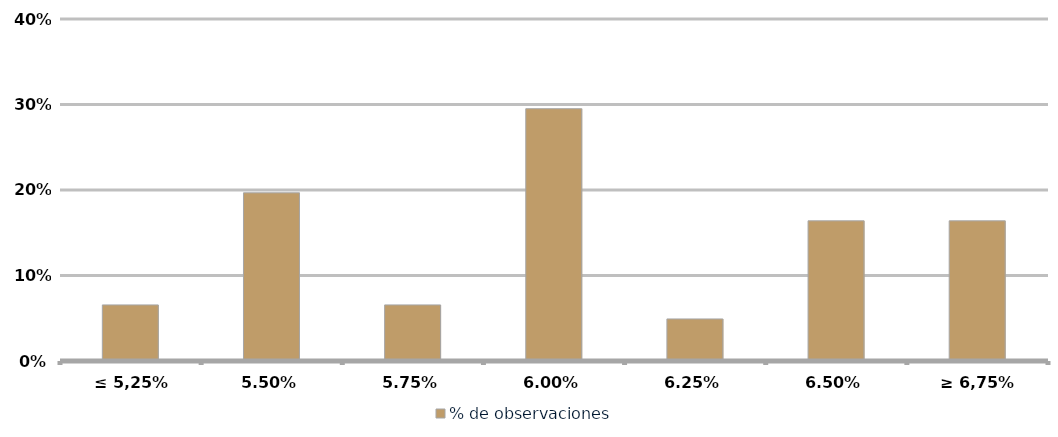
| Category | % de observaciones  |
|---|---|
| ≤ 5,25% | 0.066 |
| 5,50% | 0.197 |
| 5,75% | 0.066 |
| 6,00% | 0.295 |
| 6,25% | 0.049 |
| 6,50% | 0.164 |
| ≥ 6,75% | 0.164 |